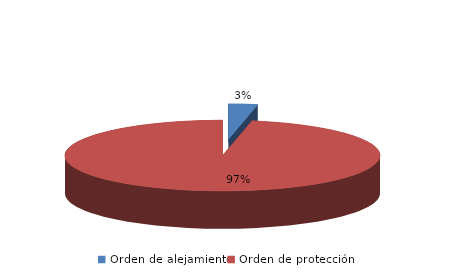
| Category | Series 0 |
|---|---|
| Orden de alejamiento | 11 |
| Orden de protección | 360 |